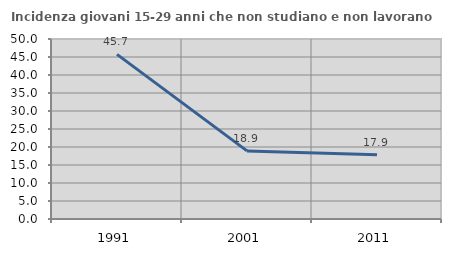
| Category | Incidenza giovani 15-29 anni che non studiano e non lavorano  |
|---|---|
| 1991.0 | 45.732 |
| 2001.0 | 18.919 |
| 2011.0 | 17.857 |